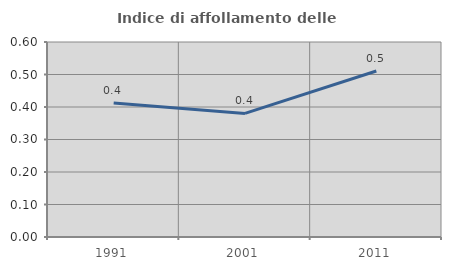
| Category | Indice di affollamento delle abitazioni  |
|---|---|
| 1991.0 | 0.412 |
| 2001.0 | 0.38 |
| 2011.0 | 0.511 |